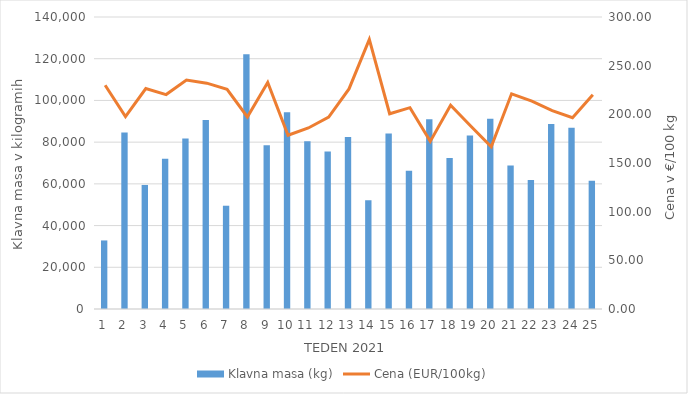
| Category | Klavna masa (kg) |
|---|---|
| 1.0 | 32871 |
| 2.0 | 84639 |
| 3.0 | 59476 |
| 4.0 | 72013 |
| 5.0 | 81759 |
| 6.0 | 90669 |
| 7.0 | 49517 |
| 8.0 | 122111 |
| 9.0 | 78545 |
| 10.0 | 94384 |
| 11.0 | 80405 |
| 12.0 | 75534 |
| 13.0 | 82440 |
| 14.0 | 52143 |
| 15.0 | 84105 |
| 16.0 | 66298 |
| 17.0 | 90925 |
| 18.0 | 72394 |
| 19.0 | 83193 |
| 20.0 | 91231 |
| 21.0 | 68763 |
| 22.0 | 61837 |
| 23.0 | 88747 |
| 24.0 | 86888 |
| 25.0 | 61507 |